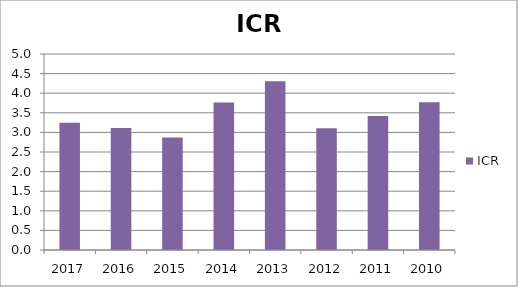
| Category | ICR |
|---|---|
| 2017.0 | 3.248 |
| 2016.0 | 3.112 |
| 2015.0 | 2.873 |
| 2014.0 | 3.76 |
| 2013.0 | 4.307 |
| 2012.0 | 3.106 |
| 2011.0 | 3.417 |
| 2010.0 | 3.768 |